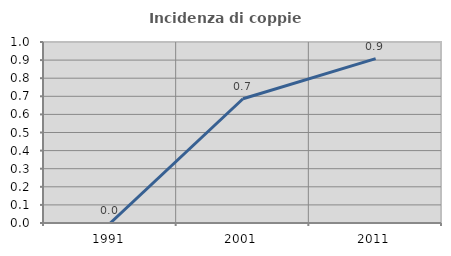
| Category | Incidenza di coppie miste |
|---|---|
| 1991.0 | 0 |
| 2001.0 | 0.686 |
| 2011.0 | 0.908 |